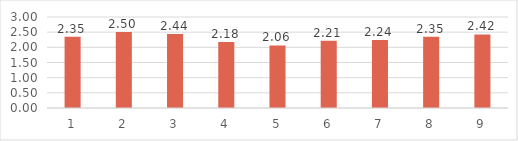
| Category | Series 0 |
|---|---|
| 0 | 2.347 |
| 1 | 2.503 |
| 2 | 2.437 |
| 3 | 2.177 |
| 4 | 2.063 |
| 5 | 2.213 |
| 6 | 2.24 |
| 7 | 2.347 |
| 8 | 2.423 |